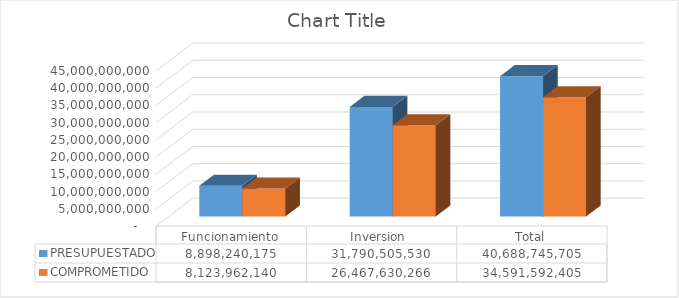
| Category | PRESUPUESTADO | COMPROMETIDO |
|---|---|---|
| Funcionamiento | 8898240175 | 8123962139.52 |
| Inversion  | 31790505530 | 26467630265.66 |
| Total | 40688745705 | 34591592405.18 |